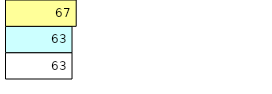
| Category | Total Standouts | Total Recd | Total Tipsters |
|---|---|---|---|
| 0 | 63 | 63 | 67 |